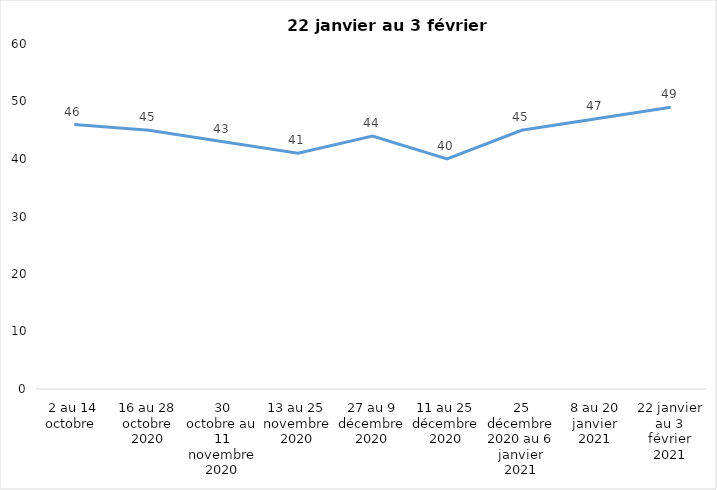
| Category | Toujours aux trois mesures |
|---|---|
| 2 au 14 octobre  | 46 |
| 16 au 28 octobre 2020 | 45 |
| 30 octobre au 11 novembre 2020 | 43 |
| 13 au 25 novembre 2020 | 41 |
| 27 au 9 décembre 2020 | 44 |
| 11 au 25 décembre 2020 | 40 |
| 25 décembre 2020 au 6 janvier 2021 | 45 |
| 8 au 20 janvier 2021 | 47 |
| 22 janvier au 3 février 2021 | 49 |